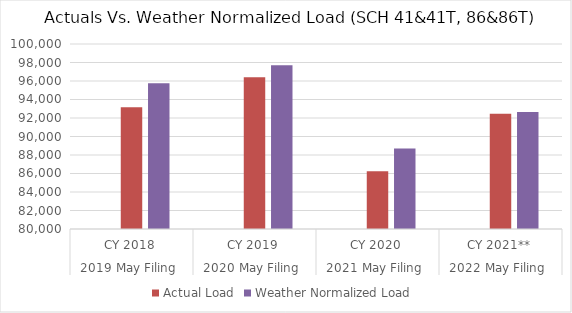
| Category | Residential: SCH 23&53 | Actual Load | Weather Normalized Load  |
|---|---|---|---|
| 0 |  | 93161.719 | 95762.954 |
| 1 |  | 96418.733 | 97692.969 |
| 2 |  | 86242.683 | 88689.236 |
| 3 |  | 92463.099 | 92660.743 |